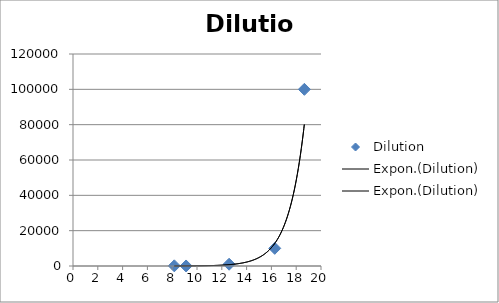
| Category | Dilution |
|---|---|
| 9.12 | 10 |
| 8.17 | 100 |
| 12.59 | 1000 |
| 16.27 | 10000 |
| 18.66 | 100000 |